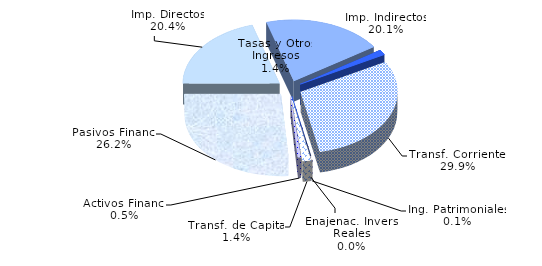
| Category | Series 0 |
|---|---|
| Imp. Directos | 20.431 |
| Imp. Indirectos | 20.096 |
| Tasas y Otros Ingresos | 1.35 |
| Transf. Corrientes | 29.932 |
| Ing. Patrimoniales | 0.056 |
| Enajenac. Invers. Reales | 0.006 |
| Transf. de Capital | 1.411 |
| Activos Financ. | 0.5 |
| Pasivos Financ. | 26.217 |